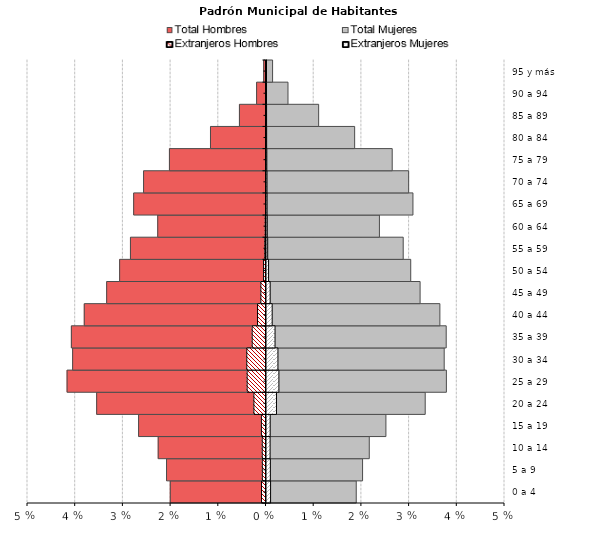
| Category | Total Hombres | Total Mujeres | Extranjeros Hombres | Extranjeros Mujeres |
|---|---|---|---|---|
| 0 a 4 | -0.02 | 0.019 | -0.001 | 0.001 |
| 5 a 9 | -0.021 | 0.02 | -0.001 | 0.001 |
| 10 a 14 | -0.023 | 0.022 | -0.001 | 0.001 |
| 15 a 19 | -0.027 | 0.025 | -0.001 | 0.001 |
| 20 a 24 | -0.036 | 0.033 | -0.003 | 0.002 |
| 25 a 29 | -0.042 | 0.038 | -0.004 | 0.003 |
| 30 a 34 | -0.041 | 0.037 | -0.004 | 0.002 |
| 35 a 39 | -0.041 | 0.038 | -0.003 | 0.002 |
| 40 a 44 | -0.038 | 0.036 | -0.002 | 0.001 |
| 45 a 49 | -0.033 | 0.032 | -0.001 | 0.001 |
| 50 a 54 | -0.031 | 0.03 | -0.001 | 0 |
| 55 a 59 | -0.028 | 0.029 | 0 | 0 |
| 60 a 64 | -0.023 | 0.024 | 0 | 0 |
| 65 a 69 | -0.028 | 0.031 | 0 | 0 |
| 70 a 74 | -0.026 | 0.03 | 0 | 0 |
| 75 a 79 | -0.02 | 0.026 | 0 | 0 |
| 80 a 84 | -0.012 | 0.018 | 0 | 0 |
| 85 a 89 | -0.006 | 0.011 | 0 | 0 |
| 90 a 94 | -0.002 | 0.005 | 0 | 0 |
| 95 y más | 0 | 0.001 | 0 | 0 |